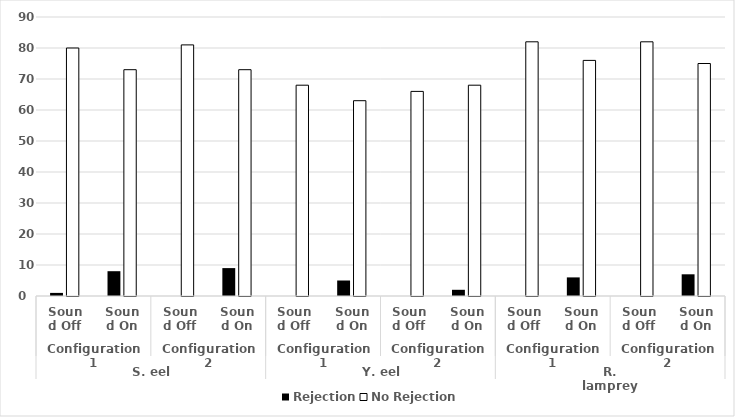
| Category | Rejection | No Rejection |
|---|---|---|
| 0 | 1 | 80 |
| 1 | 8 | 73 |
| 2 | 0 | 81 |
| 3 | 9 | 73 |
| 4 | 0 | 68 |
| 5 | 5 | 63 |
| 6 | 0 | 66 |
| 7 | 2 | 68 |
| 8 | 0 | 82 |
| 9 | 6 | 76 |
| 10 | 0 | 82 |
| 11 | 7 | 75 |